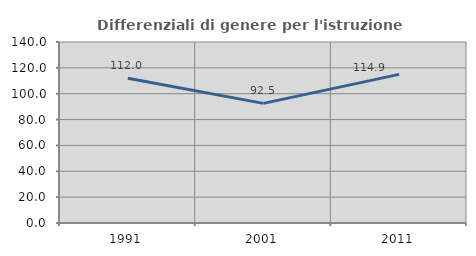
| Category | Differenziali di genere per l'istruzione superiore |
|---|---|
| 1991.0 | 112.007 |
| 2001.0 | 92.523 |
| 2011.0 | 114.943 |